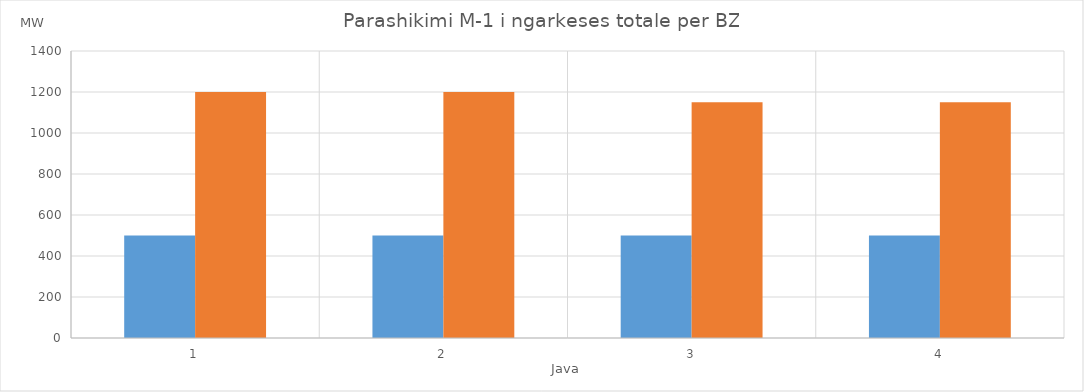
| Category | Min (MW) | Max (MW) |
|---|---|---|
| 0 | 500 | 1200 |
| 1 | 500 | 1200 |
| 2 | 500 | 1150 |
| 3 | 500 | 1150 |